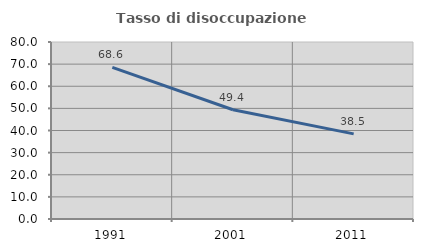
| Category | Tasso di disoccupazione giovanile  |
|---|---|
| 1991.0 | 68.553 |
| 2001.0 | 49.383 |
| 2011.0 | 38.462 |